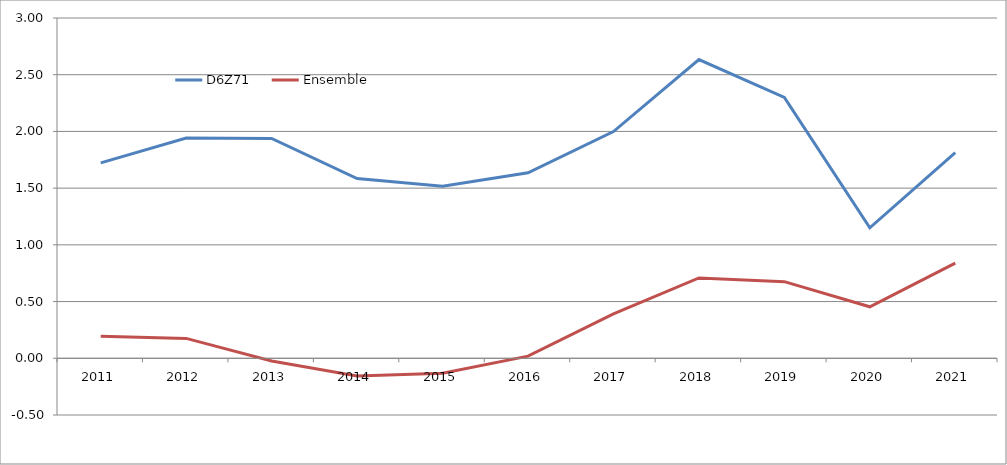
| Category | D6Z71 | Ensemble |
|---|---|---|
| 2011 | 1.723 | 0.195 |
| 2012 | 1.943 | 0.175 |
| 2013 | 1.938 | -0.024 |
| 2014 | 1.584 | -0.155 |
| 2015 | 1.516 | -0.132 |
| 2016 | 1.635 | 0.019 |
| 2017 | 1.999 | 0.391 |
| 2018 | 2.633 | 0.708 |
| 2019 | 2.3 | 0.676 |
| 2020 | 1.15 | 0.454 |
| 2021 | 1.812 | 0.838 |